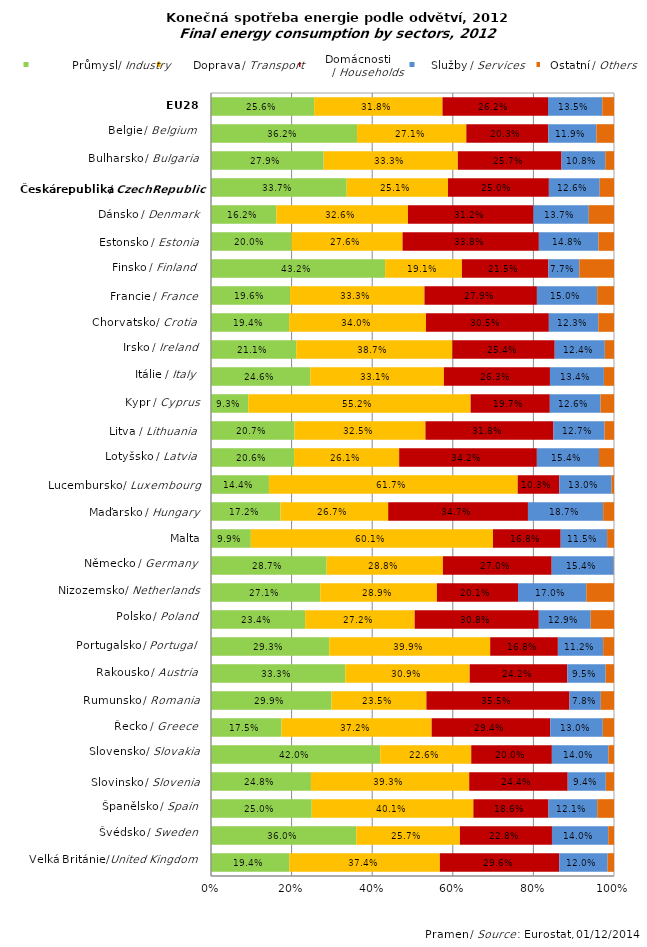
| Category | Průmysl / Industry | Doprava / Transport | Domácnosti /  | Služby / Services | ostatní / Others |
|---|---|---|---|---|---|
| United Kingdom | 0.194 | 0.374 | 0.296 | 0.12 | 0.016 |
| Sweden | 0.36 | 0.257 | 0.228 | 0.14 | 0.014 |
| Spain | 0.25 | 0.401 | 0.186 | 0.121 | 0.042 |
| Slovenia | 0.248 | 0.393 | 0.244 | 0.094 | 0.02 |
| Slovakia | 0.42 | 0.226 | 0.2 | 0.14 | 0.014 |
| Greece | 0.175 | 0.372 | 0.294 | 0.13 | 0.028 |
| Romania | 0.299 | 0.235 | 0.355 | 0.078 | 0.033 |
| Austria | 0.333 | 0.309 | 0.242 | 0.095 | 0.021 |
| Portugal | 0.293 | 0.399 | 0.168 | 0.112 | 0.027 |
| Poland | 0.234 | 0.272 | 0.308 | 0.129 | 0.058 |
| Netherlands | 0.271 | 0.289 | 0.201 | 0.17 | 0.069 |
| Germany  | 0.287 | 0.288 | 0.27 | 0.154 | 0.001 |
| Malta | 0.099 | 0.601 | 0.168 | 0.115 | 0.017 |
| Hungary | 0.172 | 0.267 | 0.347 | 0.187 | 0.027 |
| Luxembourg | 0.144 | 0.617 | 0.103 | 0.13 | 0.006 |
| Latvia | 0.206 | 0.261 | 0.342 | 0.154 | 0.037 |
| Lithuania | 0.207 | 0.325 | 0.318 | 0.127 | 0.024 |
| Cyprus | 0.093 | 0.552 | 0.197 | 0.126 | 0.033 |
| Italy | 0.246 | 0.331 | 0.263 | 0.134 | 0.025 |
| Ireland | 0.211 | 0.387 | 0.254 | 0.124 | 0.023 |
| Croatia | 0.194 | 0.34 | 0.305 | 0.123 | 0.039 |
| France | 0.196 | 0.333 | 0.279 | 0.15 | 0.042 |
| Finland | 0.432 | 0.191 | 0.215 | 0.077 | 0.086 |
| Estonia | 0.2 | 0.276 | 0.338 | 0.148 | 0.039 |
| Denmark | 0.162 | 0.326 | 0.312 | 0.137 | 0.063 |
| Czech Republic | 0.337 | 0.251 | 0.25 | 0.126 | 0.035 |
| Bulgaria | 0.279 | 0.333 | 0.257 | 0.108 | 0.022 |
| Belgium | 0.362 | 0.271 | 0.203 | 0.119 | 0.044 |
| European Union (28 countries) | 0.256 | 0.318 | 0.262 | 0.135 | 0.029 |